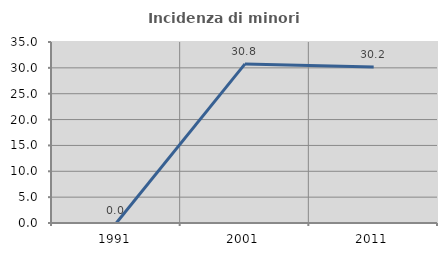
| Category | Incidenza di minori stranieri |
|---|---|
| 1991.0 | 0 |
| 2001.0 | 30.769 |
| 2011.0 | 30.178 |